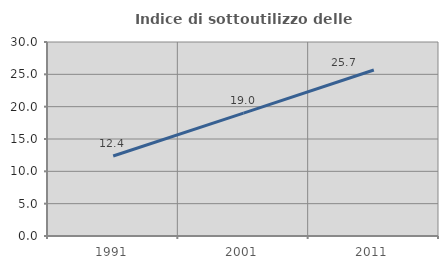
| Category | Indice di sottoutilizzo delle abitazioni  |
|---|---|
| 1991.0 | 12.376 |
| 2001.0 | 18.995 |
| 2011.0 | 25.67 |